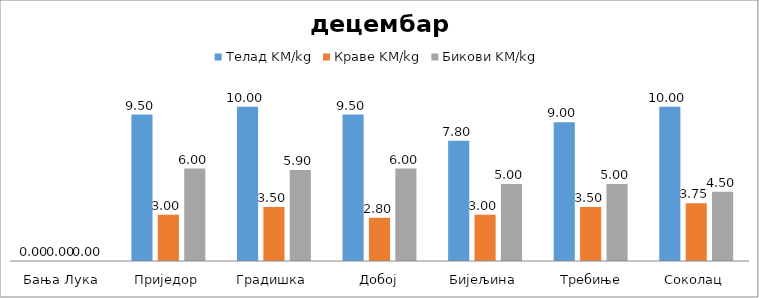
| Category | Телад KM/kg | Краве KM/kg | Бикови KM/kg |
|---|---|---|---|
| Бања Лука | 0 | 0 | 0 |
| Приједор | 9.5 | 3 | 6 |
| Градишка | 10 | 3.5 | 5.9 |
| Добој | 9.5 | 2.8 | 6 |
| Бијељина | 7.8 | 3 | 5 |
|  Требиње | 9 | 3.5 | 5 |
| Соколац | 10 | 3.75 | 4.5 |